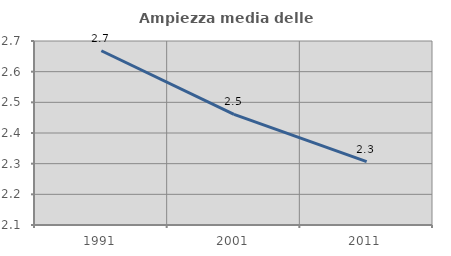
| Category | Ampiezza media delle famiglie |
|---|---|
| 1991.0 | 2.668 |
| 2001.0 | 2.461 |
| 2011.0 | 2.306 |